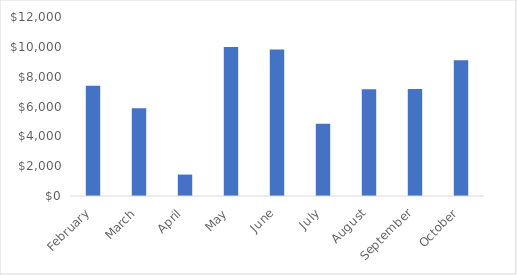
| Category | Series 0 |
|---|---|
| February | 7389 |
| March | 5880 |
| April | 1437 |
| May | 9985 |
| June | 9825 |
| July | 4838 |
| August | 7161 |
| September | 7176 |
| October | 9094 |